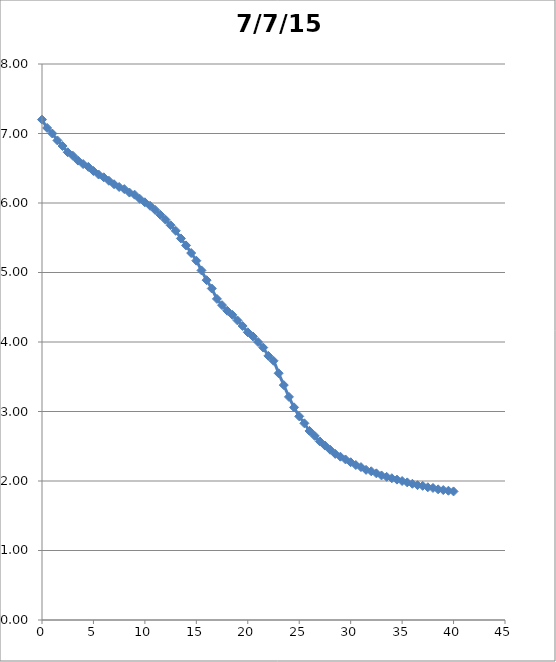
| Category | pH |
|---|---|
| 0.0 | 7.2 |
| 0.5 | 7.08 |
| 1.0 | 7 |
| 1.5 | 6.9 |
| 2.0 | 6.82 |
| 2.5 | 6.73 |
| 3.0 | 6.68 |
| 3.5 | 6.61 |
| 4.0 | 6.56 |
| 4.5 | 6.52 |
| 5.0 | 6.46 |
| 5.5 | 6.41 |
| 6.0 | 6.37 |
| 6.5 | 6.32 |
| 7.0 | 6.27 |
| 7.5 | 6.23 |
| 8.0 | 6.2 |
| 8.5 | 6.15 |
| 9.0 | 6.12 |
| 9.5 | 6.06 |
| 10.0 | 6.01 |
| 10.5 | 5.96 |
| 11.0 | 5.9 |
| 11.5 | 5.83 |
| 12.0 | 5.76 |
| 12.5 | 5.68 |
| 13.0 | 5.6 |
| 13.5 | 5.49 |
| 14.0 | 5.39 |
| 14.5 | 5.28 |
| 15.0 | 5.17 |
| 15.5 | 5.03 |
| 16.0 | 4.89 |
| 16.5 | 4.77 |
| 17.0 | 4.62 |
| 17.5 | 4.53 |
| 18.0 | 4.45 |
| 18.5 | 4.39 |
| 19.0 | 4.31 |
| 19.5 | 4.23 |
| 20.0 | 4.14 |
| 20.5 | 4.08 |
| 21.0 | 4 |
| 21.5 | 3.92 |
| 22.0 | 3.8 |
| 22.5 | 3.73 |
| 23.0 | 3.55 |
| 23.5 | 3.38 |
| 24.0 | 3.21 |
| 24.5 | 3.06 |
| 25.0 | 2.93 |
| 25.5 | 2.83 |
| 26.0 | 2.72 |
| 26.5 | 2.65 |
| 27.0 | 2.57 |
| 27.5 | 2.51 |
| 28.0 | 2.45 |
| 28.5 | 2.39 |
| 29.0 | 2.35 |
| 29.5 | 2.31 |
| 30.0 | 2.27 |
| 30.5 | 2.23 |
| 31.0 | 2.2 |
| 31.5 | 2.16 |
| 32.0 | 2.14 |
| 32.5 | 2.11 |
| 33.0 | 2.08 |
| 33.5 | 2.06 |
| 34.0 | 2.04 |
| 34.5 | 2.02 |
| 35.0 | 2 |
| 35.5 | 1.98 |
| 36.0 | 1.96 |
| 36.5 | 1.94 |
| 37.0 | 1.93 |
| 37.5 | 1.91 |
| 38.0 | 1.9 |
| 38.5 | 1.88 |
| 39.0 | 1.87 |
| 39.5 | 1.86 |
| 40.0 | 1.85 |